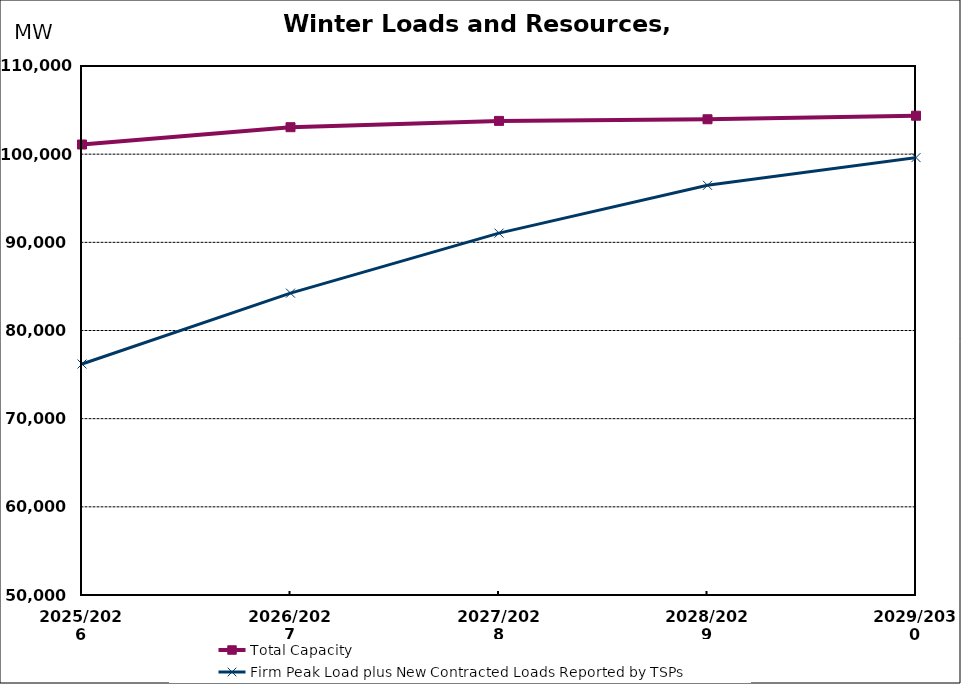
| Category | Total Capacity | Firm Peak Load plus New Contracted Loads Reported by TSPs |
|---|---|---|
| 2025/2026 | 101095.335 | 76199.872 |
| 2026/2027 | 103059.436 | 84236.647 |
| 2027/2028 | 103773.578 | 91042.639 |
| 2028/2029 | 103958.578 | 96465.805 |
| 2029/2030 | 104360.116 | 99612.905 |